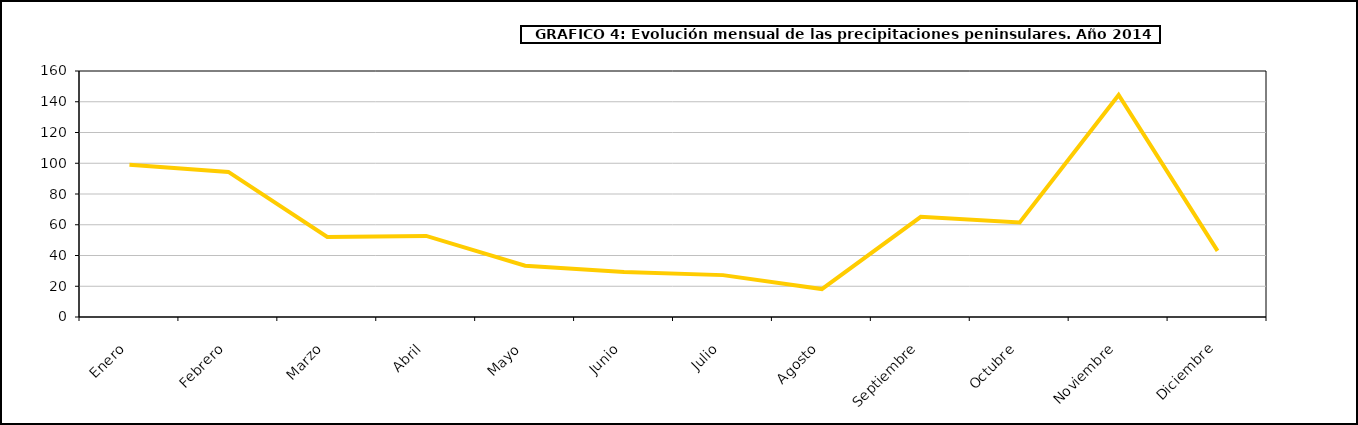
| Category | peninsula |
|---|---|
|  Enero | 98.993 |
|  Febrero | 94.354 |
|  Marzo | 52.102 |
|  Abril | 52.711 |
|  Mayo | 33.364 |
|  Junio | 29.229 |
|  Julio | 27.238 |
|  Agosto | 18.172 |
|  Septiembre | 65.192 |
|  Octubre | 61.531 |
|  Noviembre | 144.451 |
|  Diciembre | 43.013 |